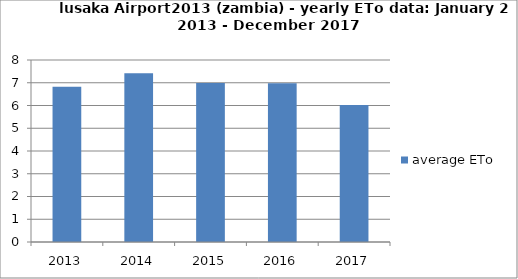
| Category | average ETo  |
|---|---|
| 2013.0 | 6.825 |
| 2014.0 | 7.417 |
| 2015.0 | 6.992 |
| 2016.0 | 6.975 |
| 2017.0 | 6.017 |